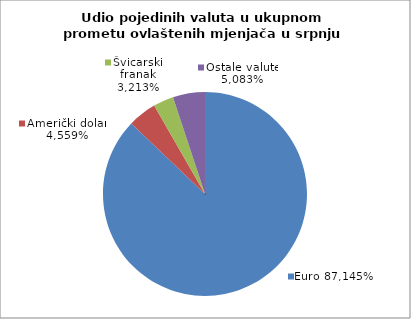
| Category | EUR |
|---|---|
| 0 | 0.871 |
| 1 | 0.046 |
| 2 | 0.032 |
| 3 | 0.051 |